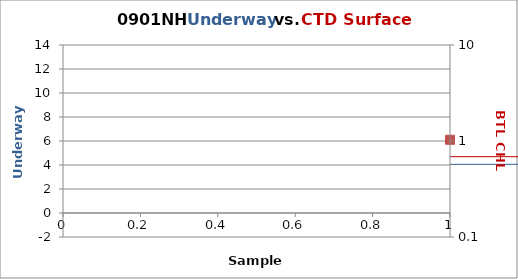
| Category | FL |
|---|---|
| 0 | 6.135 |
| 1 | 5.605 |
| 2 | 3.978 |
| 3 | 3.091 |
| 4 | 3.145 |
| 5 | 5.634 |
| 6 | 4.462 |
| 7 | 3.413 |
| 8 | 1.929 |
| 9 | 2.508 |
| 10 | 1.041 |
| 11 | 4.013 |
| 12 | 2.423 |
| 13 | 4.368 |
| 14 | 7.574 |
| 15 | 6.941 |
| 16 | 3.611 |
| 17 | 2.162 |
| 18 | 3.841 |
| 19 | 2.234 |
| 20 | 4.547 |
| 21 | 9.759 |
| 22 | 2.804 |
| 23 | 6.198 |
| 24 | 7.005 |
| 25 | 2.333 |
| 26 | 1.826 |
| 27 | 5.422 |
| 28 | 0.713 |
| 29 | 8.091 |
| 30 | 11.73 |
| 31 | 5.467 |
| 32 | 3.59 |
| 33 | 7.997 |
| 34 | 8.696 |
| 35 | 4.982 |
| 36 | 6.417 |
| 37 | 3.002 |
| 38 | 4.319 |
| 39 | 2.624 |
| 40 | 5.238 |
| 41 | 3.818 |
| 42 | 3.599 |
| 43 | 6.342 |
| 44 | 6.727 |
| 45 | 0.906 |
| 46 | 3.27 |
| 47 | 6.386 |
| 48 | 4.058 |
| 49 | 6.125 |
| 50 | 5.398 |